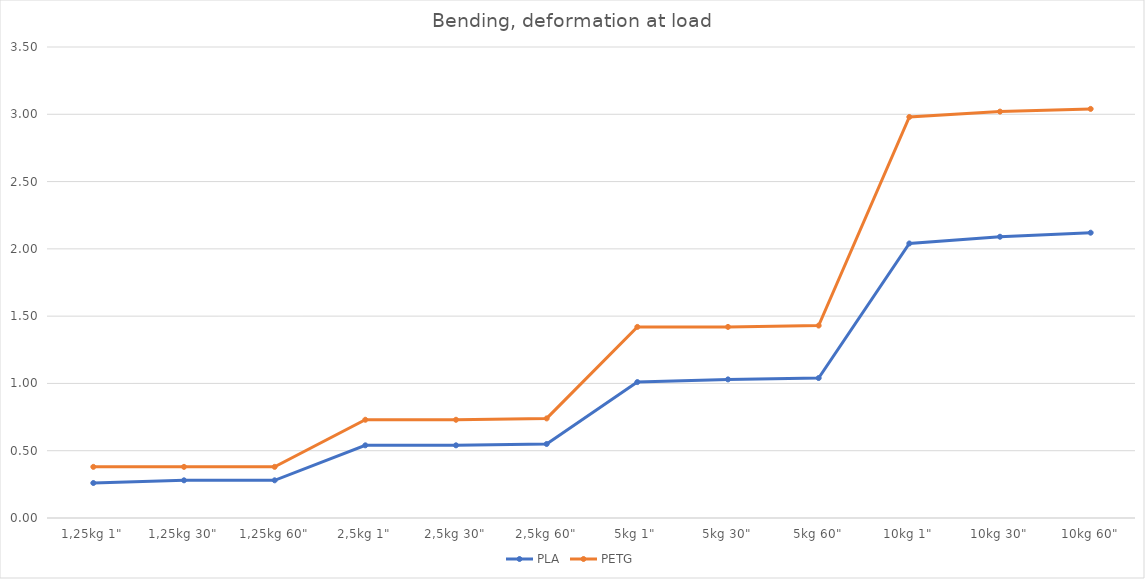
| Category | PLA | PETG |
|---|---|---|
| 1,25kg 1" | 0.26 | 0.38 |
| 1,25kg 30" | 0.28 | 0.38 |
| 1,25kg 60" | 0.28 | 0.38 |
| 2,5kg 1" | 0.54 | 0.73 |
| 2,5kg 30" | 0.54 | 0.73 |
| 2,5kg 60" | 0.55 | 0.74 |
| 5kg 1" | 1.01 | 1.42 |
| 5kg 30" | 1.03 | 1.42 |
| 5kg 60" | 1.04 | 1.43 |
| 10kg 1" | 2.04 | 2.98 |
| 10kg 30" | 2.09 | 3.02 |
| 10kg 60" | 2.12 | 3.04 |